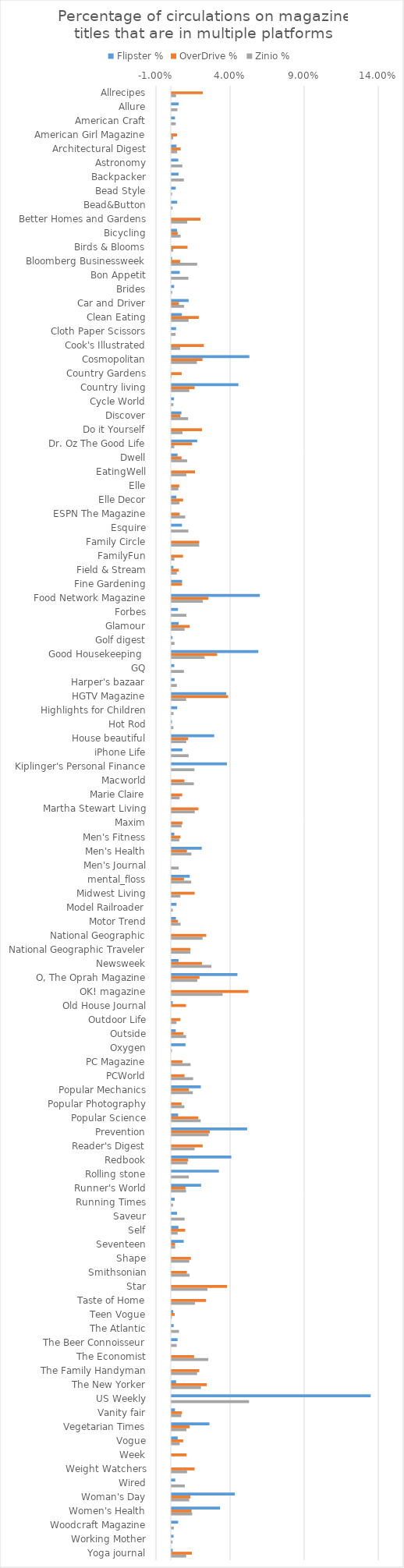
| Category | Flipster % | OverDrive % | Zinio % |
|---|---|---|---|
| Allrecipes | 0 | 0.021 | 0.003 |
| Allure | 0.005 | 0 | 0.004 |
| American Craft | 0.002 | 0 | 0.003 |
| American Girl Magazine | 0 | 0.004 | 0.001 |
| Architectural Digest | 0.003 | 0.006 | 0.004 |
| Astronomy | 0.005 | 0 | 0.007 |
| Backpacker | 0.005 | 0 | 0.008 |
| Bead Style | 0.003 | 0 | 0 |
| Bead&Button | 0.004 | 0 | 0.001 |
| Better Homes and Gardens | 0 | 0.019 | 0.011 |
| Bicycling | 0.004 | 0.004 | 0.006 |
| Birds & Blooms | 0 | 0.011 | 0.001 |
| Bloomberg Businessweek | 0 | 0.006 | 0.017 |
| Bon Appetit | 0.006 | 0 | 0.011 |
| Brides | 0.002 | 0 | 0 |
| Car and Driver | 0.012 | 0.005 | 0.008 |
| Clean Eating | 0.007 | 0.018 | 0.011 |
| Cloth Paper Scissors | 0.003 | 0 | 0.003 |
| Cook's Illustrated | 0 | 0.022 | 0.006 |
| Cosmopolitan | 0.052 | 0.021 | 0.017 |
| Country Gardens | 0 | 0.007 | 0 |
| Country living | 0.045 | 0.016 | 0.012 |
| Cycle World | 0.002 | 0 | 0.001 |
| Discover | 0.007 | 0.006 | 0.011 |
| Do it Yourself | 0 | 0.02 | 0.007 |
| Dr. Oz The Good Life | 0.017 | 0.014 | 0.002 |
| Dwell | 0.004 | 0.007 | 0.011 |
| EatingWell | 0 | 0.016 | 0.01 |
| Elle | 0 | 0.005 | 0.005 |
| Elle Decor | 0.003 | 0.008 | 0.005 |
| ESPN The Magazine | 0 | 0.005 | 0.009 |
| Esquire | 0.007 | 0 | 0.011 |
| Family Circle | 0 | 0.019 | 0.019 |
| FamilyFun | 0 | 0.008 | 0.002 |
| Field & Stream | 0.001 | 0.005 | 0.004 |
| Fine Gardening | 0.007 | 0.007 | 0 |
| Food Network Magazine | 0.06 | 0.025 | 0.021 |
| Forbes | 0.004 | 0 | 0.01 |
| Glamour | 0.005 | 0.012 | 0.009 |
| Golf digest | 0.001 | 0 | 0.002 |
| Good Housekeeping  | 0.059 | 0.031 | 0.022 |
| GQ | 0.002 | 0 | 0.008 |
| Harper's bazaar | 0.002 | 0 | 0.004 |
| HGTV Magazine | 0.037 | 0.038 | 0.01 |
| Highlights for Children | 0.004 | 0 | 0.001 |
| Hot Rod | 0 | 0 | 0.001 |
| House beautiful | 0.029 | 0.011 | 0.01 |
| iPhone Life | 0.007 | 0 | 0.011 |
| Kiplinger's Personal Finance | 0.037 | 0 | 0.015 |
| Macworld | 0 | 0.009 | 0.015 |
| Marie Claire | 0 | 0.007 | 0.005 |
| Martha Stewart Living | 0 | 0.018 | 0.016 |
| Maxim | 0 | 0.007 | 0.007 |
| Men's Fitness | 0.002 | 0.006 | 0.005 |
| Men's Health | 0.02 | 0.01 | 0.013 |
| Men's Journal | 0 | 0 | 0.005 |
| mental_floss | 0.012 | 0.008 | 0.013 |
| Midwest Living | 0 | 0.016 | 0.006 |
| Model Railroader | 0.003 | 0 | 0.001 |
| Motor Trend | 0.003 | 0.004 | 0.006 |
| National Geographic | 0 | 0.023 | 0.021 |
| National Geographic Traveler | 0 | 0.013 | 0.013 |
| Newsweek | 0.005 | 0.02 | 0.027 |
| O, The Oprah Magazine | 0.044 | 0.019 | 0.017 |
| OK! magazine | 0 | 0.052 | 0.034 |
| Old House Journal | 0.001 | 0.01 | 0 |
| Outdoor Life | 0 | 0.006 | 0.003 |
| Outside | 0.003 | 0.008 | 0.01 |
| Oxygen | 0.009 | 0 | 0 |
| PC Magazine | 0 | 0.007 | 0.013 |
| PCWorld | 0 | 0.009 | 0.015 |
| Popular Mechanics | 0.02 | 0.012 | 0.014 |
| Popular Photography | 0 | 0.007 | 0.009 |
| Popular Science | 0.004 | 0.018 | 0.02 |
| Prevention | 0.051 | 0.026 | 0.025 |
| Reader's Digest | 0 | 0.021 | 0.016 |
| Redbook | 0.04 | 0.011 | 0.011 |
| Rolling stone | 0.032 | 0 | 0.012 |
| Runner's World | 0.02 | 0.009 | 0.01 |
| Running Times | 0.002 | 0 | 0.001 |
| Saveur | 0.004 | 0 | 0.009 |
| Self | 0.005 | 0.009 | 0.004 |
| Seventeen | 0.008 | 0.002 | 0.002 |
| Shape | 0 | 0.013 | 0.012 |
| Smithsonian | 0 | 0.01 | 0.012 |
| Star | 0 | 0.037 | 0.024 |
| Taste of Home | 0 | 0.023 | 0.016 |
| Teen Vogue | 0.001 | 0.002 | 0 |
| The Atlantic | 0.001 | 0 | 0.005 |
| The Beer Connoisseur | 0.004 | 0 | 0.003 |
| The Economist | 0 | 0.015 | 0.025 |
| The Family Handyman | 0 | 0.019 | 0.017 |
| The New Yorker | 0.003 | 0.024 | 0.02 |
| US Weekly | 0.134 | 0 | 0.052 |
| Vanity fair | 0.002 | 0.007 | 0.007 |
| Vegetarian Times | 0.026 | 0.012 | 0.01 |
| Vogue | 0.004 | 0.008 | 0.005 |
| Week | 0 | 0.01 | 0 |
| Weight Watchers | 0 | 0.016 | 0.01 |
| Wired | 0.002 | 0 | 0.009 |
| Woman's Day | 0.043 | 0.013 | 0.012 |
| Women's Health | 0.033 | 0.013 | 0.014 |
| Woodcraft Magazine | 0.004 | 0 | 0.002 |
| Working Mother | 0.001 | 0 | 0.001 |
| Yoga journal | 0.001 | 0.014 | 0.01 |